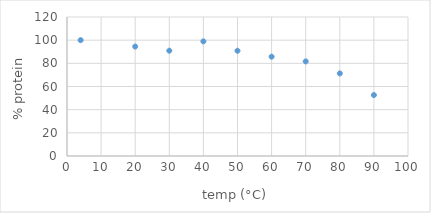
| Category | Series 0 |
|---|---|
| 4.0 | 100 |
| 20.0 | 94.479 |
| 30.0 | 90.909 |
| 40.0 | 98.96 |
| 50.0 | 90.858 |
| 60.0 | 85.744 |
| 70.0 | 81.663 |
| 80.0 | 71.279 |
| 90.0 | 52.63 |